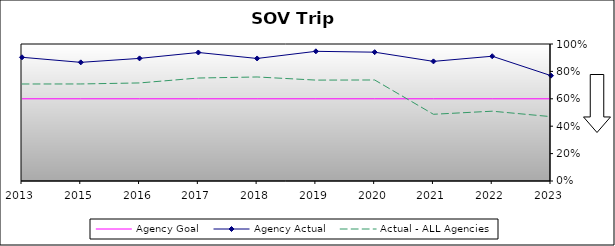
| Category | Agency Goal | Agency Actual | Actual - ALL Agencies |
|---|---|---|---|
| 2013.0 | 0.6 | 0.903 | 0.708 |
| 2015.0 | 0.6 | 0.866 | 0.708 |
| 2016.0 | 0.6 | 0.895 | 0.716 |
| 2017.0 | 0.6 | 0.938 | 0.752 |
| 2018.0 | 0.6 | 0.894 | 0.759 |
| 2019.0 | 0.6 | 0.947 | 0.736 |
| 2020.0 | 0.6 | 0.94 | 0.737 |
| 2021.0 | 0.6 | 0.873 | 0.487 |
| 2022.0 | 0.6 | 0.911 | 0.509 |
| 2023.0 | 0.6 | 0.769 | 0.47 |